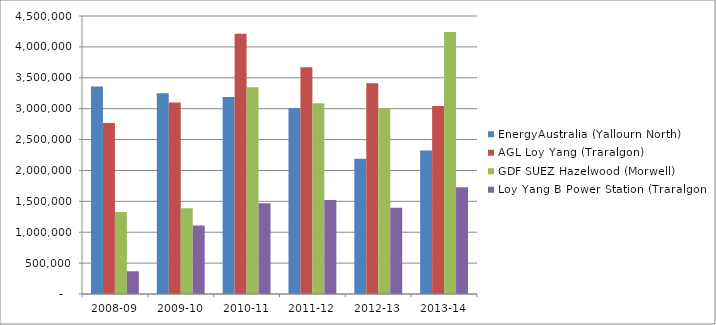
| Category | EnergyAustralia (Yallourn North) | AGL Loy Yang (Traralgon) | GDF SUEZ Hazelwood (Morwell) | Loy Yang B Power Station (Traralgon) |
|---|---|---|---|---|
| 2008-09 | 3360000 | 2770000 | 1328536 | 368038.6 |
| 2009-10 | 3250000 | 3100000 | 1389616 | 1110039.1 |
| 2010-11 | 3190000 | 4214000 | 3348393 | 1470009.02 |
| 2011-12 | 3010000 | 3670224.759 | 3085862 | 1520013.6 |
| 2012-13 | 2188000 | 3412617.23 | 3007948 | 1396844.56 |
| 2013-14 | 2324600 | 3044712.4 | 4240965 | 1729921 |